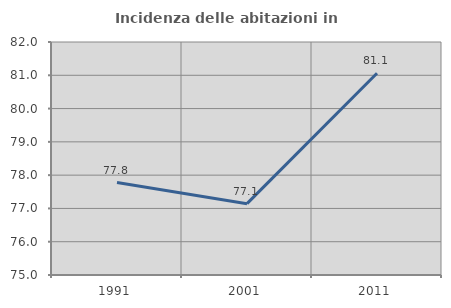
| Category | Incidenza delle abitazioni in proprietà  |
|---|---|
| 1991.0 | 77.778 |
| 2001.0 | 77.143 |
| 2011.0 | 81.063 |